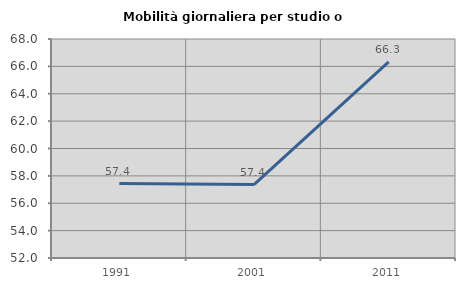
| Category | Mobilità giornaliera per studio o lavoro |
|---|---|
| 1991.0 | 57.44 |
| 2001.0 | 57.367 |
| 2011.0 | 66.33 |